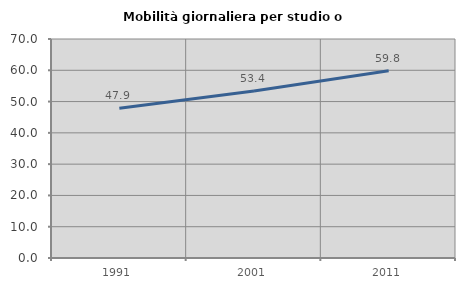
| Category | Mobilità giornaliera per studio o lavoro |
|---|---|
| 1991.0 | 47.9 |
| 2001.0 | 53.356 |
| 2011.0 | 59.833 |